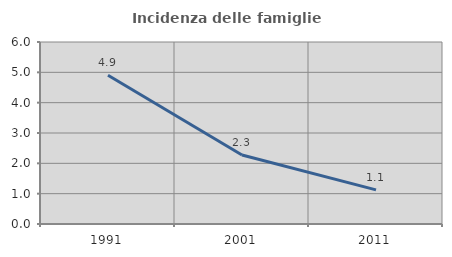
| Category | Incidenza delle famiglie numerose |
|---|---|
| 1991.0 | 4.902 |
| 2001.0 | 2.273 |
| 2011.0 | 1.124 |